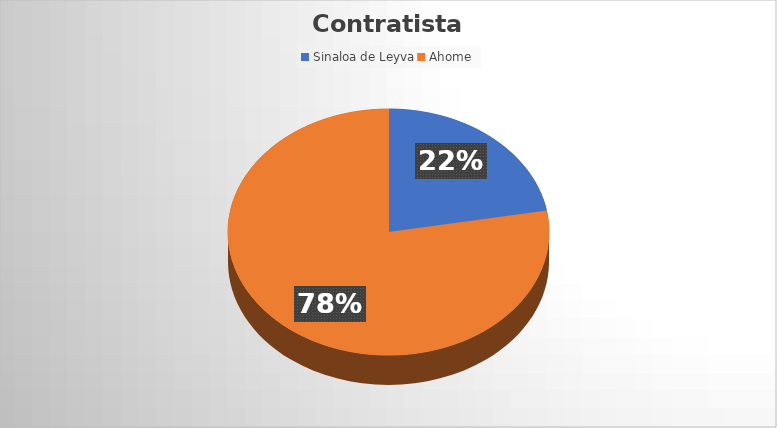
| Category | Suma |
|---|---|
| Sinaloa de Leyva | 10399649.6 |
| Ahome | 36465309.68 |